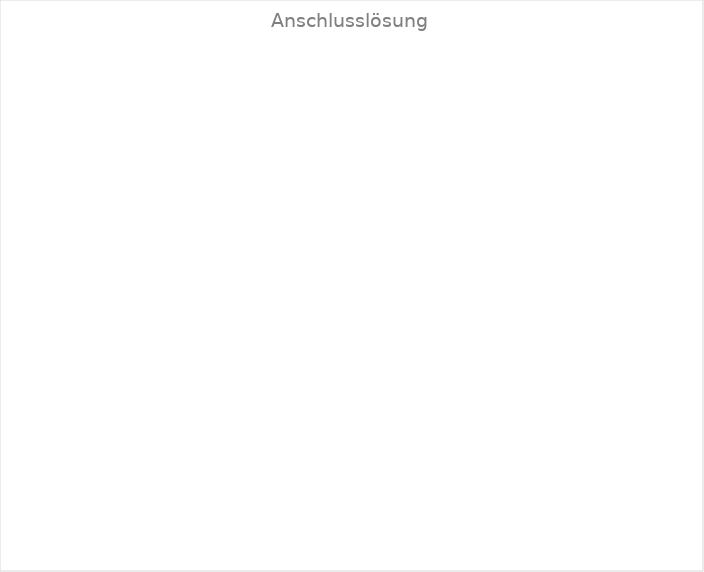
| Category | Series 0 |
|---|---|
| 1. Arbeitsmarkt (orts- und branchenüblicher Lohn) | 0 |
| 1. Arbeitsmarkt (reduzierter Lohn) | 0 |
| geschützter Arbeitsplatz | 0 |
| Weiterführende Ausbildung | 0 |
| Keine Anschlusslösung | 0 |